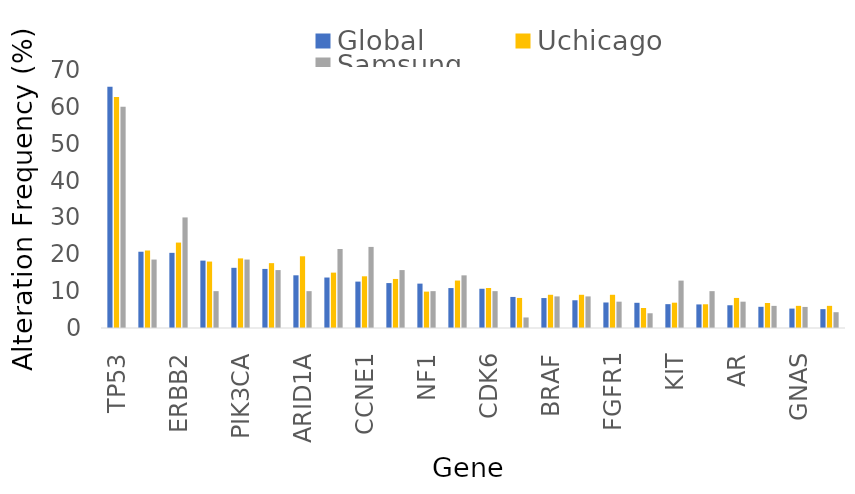
| Category | Global | Uchicago | Samsung |
|---|---|---|---|
| TP53 | 65.463 | 62.661 | 60 |
| EGFR | 20.692 | 21.03 | 18.571 |
| ERBB2 | 20.391 | 23.176 | 30 |
| KRAS | 18.284 | 18.026 | 10 |
| PIK3CA | 16.328 | 18.884 | 18.571 |
| MYC | 16.027 | 17.597 | 15.714 |
| ARID1A | 14.297 | 19.457 | 10 |
| MET | 13.695 | 15.021 | 21.429 |
| CCNE1 | 12.587 | 14.027 | 22 |
| APC | 12.19 | 13.305 | 15.714 |
| NF1 | 12.039 | 9.871 | 10 |
| FGFR2 | 10.835 | 12.876 | 14.286 |
| CDK6 | 10.645 | 10.86 | 10 |
| CDKN2A | 8.427 | 8.155 | 2.857 |
| BRAF | 8.126 | 9.013 | 8.571 |
| SMAD4 | 7.524 | 9.013 | 8.571 |
| FGFR1 | 6.922 | 9.013 | 7.143 |
| BRCA2 | 6.838 | 5.43 | 4 |
| KIT | 6.471 | 6.867 | 12.857 |
| PDGFRA | 6.396 | 6.438 | 10 |
| AR | 6.17 | 8.155 | 7.143 |
| RAF1 | 5.75 | 6.787 | 6 |
| GNAS | 5.267 | 6.009 | 5.714 |
| PTEN | 5.117 | 6.009 | 4.286 |